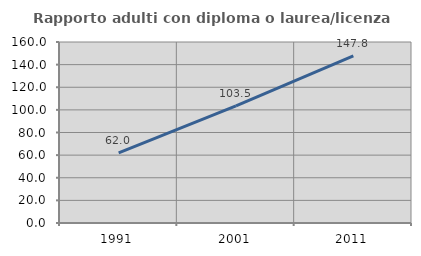
| Category | Rapporto adulti con diploma o laurea/licenza media  |
|---|---|
| 1991.0 | 61.976 |
| 2001.0 | 103.472 |
| 2011.0 | 147.826 |